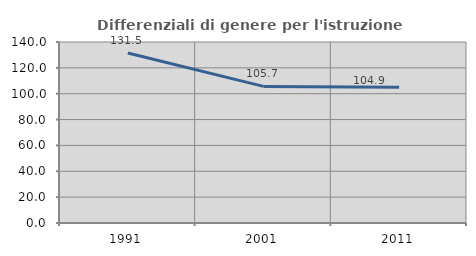
| Category | Differenziali di genere per l'istruzione superiore |
|---|---|
| 1991.0 | 131.467 |
| 2001.0 | 105.666 |
| 2011.0 | 104.924 |